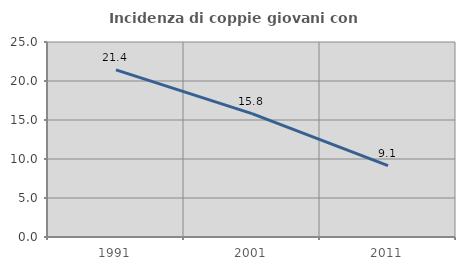
| Category | Incidenza di coppie giovani con figli |
|---|---|
| 1991.0 | 21.424 |
| 2001.0 | 15.812 |
| 2011.0 | 9.139 |